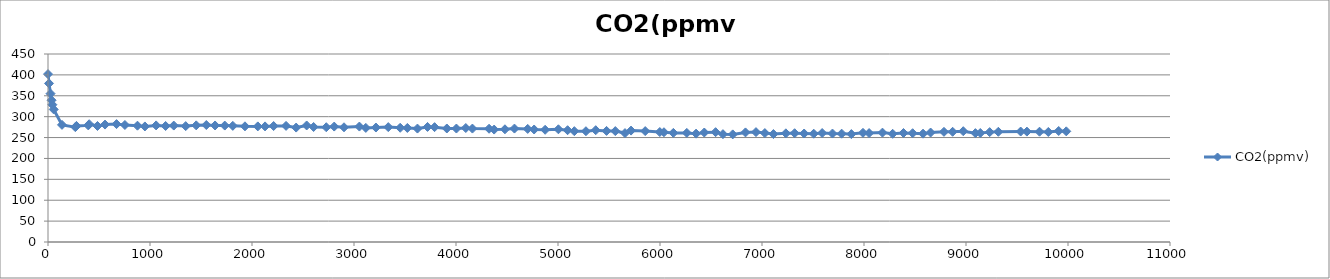
| Category | CO2(ppmv) |
|---|---|
| 0.0 | 401.9 |
| 10.0 | 379.6 |
| 25.0 | 355.1 |
| 35.0 | 339.3 |
| 43.0 | 328.6 |
| 56.0 | 317.3 |
| 137.0 | 280.4 |
| 268.0 | 274.9 |
| 279.0 | 277.9 |
| 395.0 | 279.1 |
| 404.0 | 281.9 |
| 485.0 | 277.7 |
| 559.0 | 281.1 |
| 672.0 | 282.2 |
| 754.0 | 280.1 |
| 877.0 | 278.4 |
| 950.0 | 276.6 |
| 1060.0 | 279.1 |
| 1153.0 | 277.7 |
| 1233.0 | 278.7 |
| 1350.0 | 277.4 |
| 1453.0 | 279.2 |
| 1552.0 | 280 |
| 1638.0 | 278.9 |
| 1733.0 | 278.7 |
| 1812.0 | 278 |
| 1931.0 | 276.9 |
| 2057.0 | 276.7 |
| 2128.0 | 276.7 |
| 2212.0 | 277.6 |
| 2334.0 | 277.9 |
| 2433.0 | 273.9 |
| 2536.0 | 278.9 |
| 2604.0 | 275.3 |
| 2728.0 | 274.7 |
| 2806.0 | 276.3 |
| 2902.0 | 274.6 |
| 3053.0 | 276.3 |
| 3116.0 | 273.1 |
| 3215.0 | 274 |
| 3336.0 | 275 |
| 3453.0 | 273.4 |
| 3523.0 | 273 |
| 3622.0 | 271.5 |
| 3721.0 | 275.4 |
| 3790.0 | 274.9 |
| 3910.0 | 271.7 |
| 4004.0 | 271.6 |
| 4096.0 | 272.8 |
| 4161.0 | 271.5 |
| 4324.0 | 271.1 |
| 4374.0 | 269.1 |
| 4480.0 | 269.8 |
| 4573.0 | 271.5 |
| 4703.0 | 270.7 |
| 4766.0 | 269.3 |
| 4874.0 | 268.6 |
| 5004.0 | 269.8 |
| 5094.0 | 267.6 |
| 5160.0 | 265.3 |
| 5274.0 | 265.2 |
| 5370.0 | 267.6 |
| 5476.0 | 265.9 |
| 5562.0 | 265.5 |
| 5657.0 | 260.7 |
| 5716.0 | 266.7 |
| 5855.0 | 265.5 |
| 5998.0 | 263.2 |
| 6039.0 | 262.7 |
| 6131.0 | 261.2 |
| 6263.0 | 261.1 |
| 6354.0 | 259.4 |
| 6434.0 | 262.1 |
| 6545.0 | 262.9 |
| 6617.0 | 258.1 |
| 6713.0 | 257.6 |
| 6838.0 | 262.3 |
| 6941.0 | 263 |
| 7028.0 | 260.7 |
| 7112.0 | 258.4 |
| 7234.0 | 260.1 |
| 7320.0 | 260.4 |
| 7413.0 | 259.7 |
| 7507.0 | 259.2 |
| 7590.0 | 260.8 |
| 7691.0 | 259.6 |
| 7781.0 | 259.3 |
| 7876.0 | 258.3 |
| 7990.0 | 261.3 |
| 8050.0 | 260.7 |
| 8181.0 | 261.8 |
| 8281.0 | 259 |
| 8387.0 | 260.9 |
| 8477.0 | 260.4 |
| 8579.0 | 259.3 |
| 8653.0 | 262 |
| 8784.0 | 263.7 |
| 8869.0 | 263.8 |
| 8973.0 | 265.2 |
| 9092.0 | 260.6 |
| 9140.0 | 260.9 |
| 9232.0 | 263 |
| 9317.0 | 263.8 |
| 9536.0 | 264.4 |
| 9597.0 | 264.2 |
| 9721.0 | 264 |
| 9807.0 | 263.4 |
| 9909.0 | 265.7 |
| 9983.0 | 264.9 |